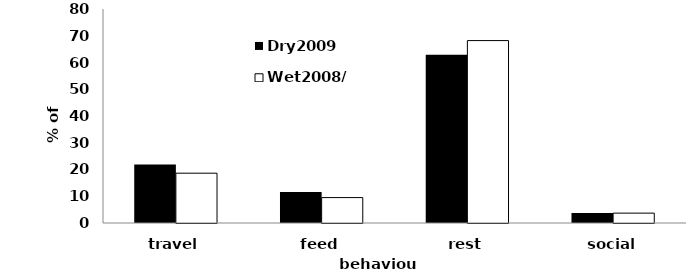
| Category | Dry2009 | Wet2008/09 |
|---|---|---|
| travel | 21.87 | 18.62 |
| feed | 11.56 | 9.5 |
| rest | 62.86 | 68.19 |
| social | 3.71 | 3.69 |